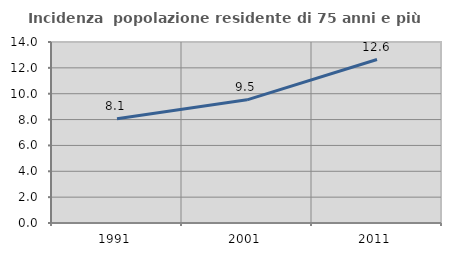
| Category | Incidenza  popolazione residente di 75 anni e più |
|---|---|
| 1991.0 | 8.063 |
| 2001.0 | 9.526 |
| 2011.0 | 12.642 |